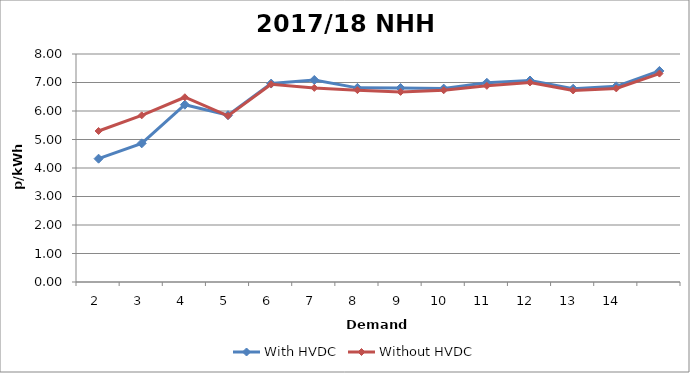
| Category | With HVDC | Without HVDC |
|---|---|---|
| 2.0 | 4.327 | 5.299 |
| 3.0 | 4.866 | 5.848 |
| 4.0 | 6.221 | 6.483 |
| 5.0 | 5.853 | 5.829 |
| 6.0 | 6.962 | 6.938 |
| 7.0 | 7.088 | 6.811 |
| 8.0 | 6.812 | 6.732 |
| 9.0 | 6.806 | 6.67 |
| 10.0 | 6.786 | 6.727 |
| 11.0 | 6.99 | 6.882 |
| 12.0 | 7.07 | 7.001 |
| 13.0 | 6.779 | 6.721 |
| 14.0 | 6.866 | 6.792 |